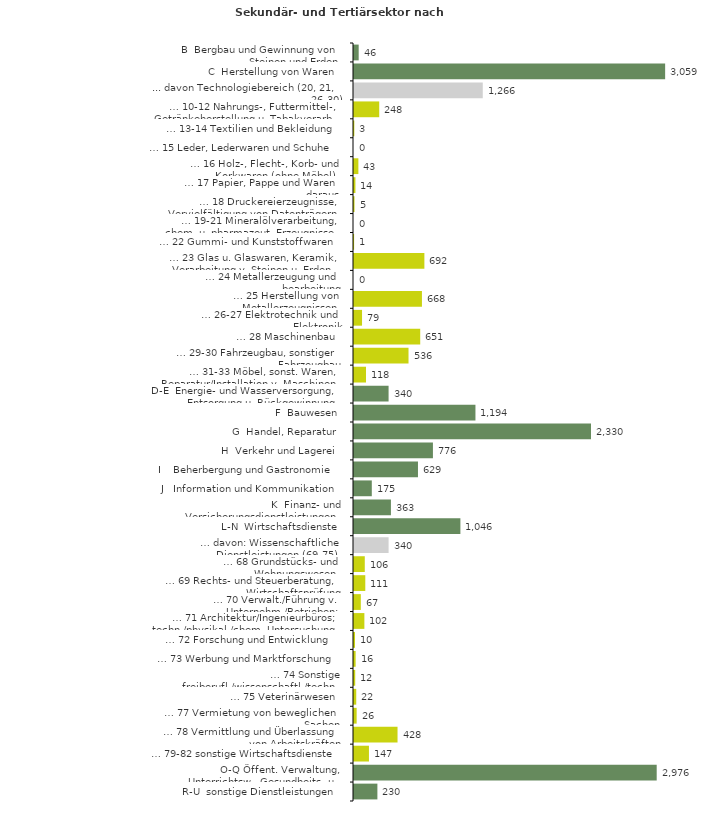
| Category | Series 0 |
|---|---|
| B  Bergbau und Gewinnung von Steinen und Erden | 46 |
| C  Herstellung von Waren | 3059 |
| ... davon Technologiebereich (20, 21, 26-30) | 1266 |
| … 10-12 Nahrungs-, Futtermittel-, Getränkeherstellung u. Tabakverarb. | 248 |
| … 13-14 Textilien und Bekleidung | 3 |
| … 15 Leder, Lederwaren und Schuhe | 0 |
| … 16 Holz-, Flecht-, Korb- und Korkwaren (ohne Möbel)  | 43 |
| … 17 Papier, Pappe und Waren daraus  | 14 |
| … 18 Druckereierzeugnisse, Vervielfältigung von Datenträgern | 5 |
| … 19-21 Mineralölverarbeitung, chem. u. pharmazeut. Erzeugnisse | 0 |
| … 22 Gummi- und Kunststoffwaren | 1 |
| … 23 Glas u. Glaswaren, Keramik, Verarbeitung v. Steinen u. Erden  | 692 |
| … 24 Metallerzeugung und -bearbeitung | 0 |
| … 25 Herstellung von Metallerzeugnissen  | 668 |
| … 26-27 Elektrotechnik und Elektronik | 79 |
| … 28 Maschinenbau | 651 |
| … 29-30 Fahrzeugbau, sonstiger Fahrzeugbau | 536 |
| … 31-33 Möbel, sonst. Waren, Reparatur/Installation v. Maschinen | 118 |
| D-E  Energie- und Wasserversorgung, Entsorgung u. Rückgewinnung | 340 |
| F  Bauwesen | 1194 |
| G  Handel, Reparatur | 2330 |
| H  Verkehr und Lagerei | 776 |
| I    Beherbergung und Gastronomie | 629 |
| J   Information und Kommunikation | 175 |
| K  Finanz- und Versicherungsdienstleistungen | 363 |
| L-N  Wirtschaftsdienste | 1046 |
| … davon: Wissenschaftliche Dienstleistungen (69-75) | 340 |
| … 68 Grundstücks- und Wohnungswesen  | 106 |
| … 69 Rechts- und Steuerberatung, Wirtschaftsprüfung | 111 |
| … 70 Verwalt./Führung v. Unternehm./Betrieben; Unternehmensberat. | 67 |
| … 71 Architektur/Ingenieurbüros; techn./physikal./chem. Untersuchung | 102 |
| … 72 Forschung und Entwicklung  | 10 |
| … 73 Werbung und Marktforschung | 16 |
| … 74 Sonstige freiberufl./wissenschaftl./techn. Tätigkeiten | 12 |
| … 75 Veterinärwesen | 22 |
| … 77 Vermietung von beweglichen Sachen  | 26 |
| … 78 Vermittlung und Überlassung von Arbeitskräften | 428 |
| … 79-82 sonstige Wirtschaftsdienste | 147 |
| O-Q Öffent. Verwaltung, Unterrichtsw., Gesundheits- u. Sozialwesen | 2976 |
| R-U  sonstige Dienstleistungen | 230 |